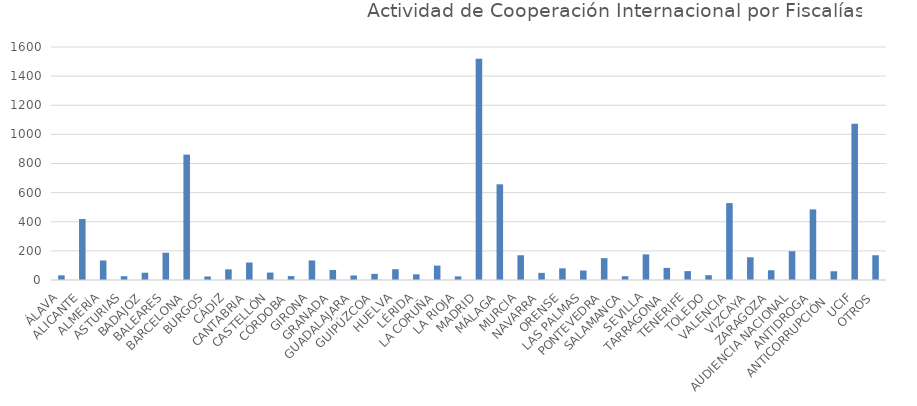
| Category | Nº DE EXPEDIENTES |
|---|---|
| ÁLAVA | 32 |
| ALICANTE | 419 |
| ALMERÍA | 134 |
| ASTURIAS | 26 |
| BADAJOZ | 50 |
| BALEARES | 187 |
| BARCELONA | 861 |
| BURGOS | 24 |
| CÁDIZ | 73 |
| CANTABRIA | 120 |
| CASTELLÓN | 51 |
| CÓRDOBA | 27 |
| GIRONA | 134 |
| GRANADA | 69 |
| GUADALAJARA | 31 |
| GUIPÚZCOA | 42 |
| HUELVA | 74 |
| LÉRIDA | 39 |
| LA CORUÑA | 99 |
| LA RIOJA | 25 |
| MADRID | 1519 |
| MÁLAGA | 657 |
| MURCIA | 170 |
| NAVARRA | 49 |
| ORENSE | 80 |
| LAS PALMAS | 65 |
| PONTEVEDRA | 150 |
| SALAMANCA | 26 |
| SEVILLA | 176 |
| TARRAGONA | 83 |
| TENERIFE | 61 |
| TOLEDO | 33 |
| VALENCIA | 528 |
| VIZCAYA | 156 |
| ZARAGOZA | 67 |
| AUDIENCIA NACIONAL | 198 |
| ANTIDROGA | 485 |
| ANTICORRUPCIÓN  | 60 |
| UCIF | 1073 |
| OTROS | 170 |